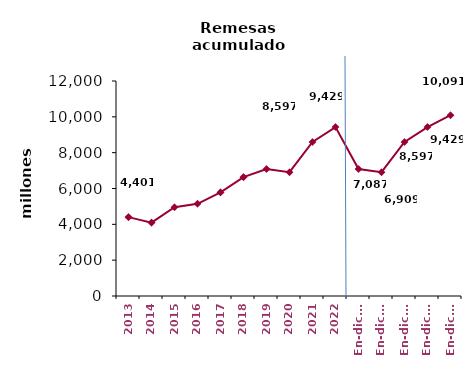
| Category | Series 0 |
|---|---|
| 2013 | 4401.04 |
| 2014 | 4093.21 |
| 2015 | 4957.39 |
| 2016 | 5147.47 |
| 2017 | 5783.73 |
| 2018 | 6636.2 |
| 2019 | 7086.53 |
| 2020 | 6908.85 |
| 2021 | 8597.25 |
| 2022 | 9428.81 |
| En-dic.19 | 7086.53 |
| En-dic.20 | 6908.85 |
| En-dic.21 | 8597.25 |
| En-dic.22 | 9428.81 |
| En-dic.23 | 10091.07 |